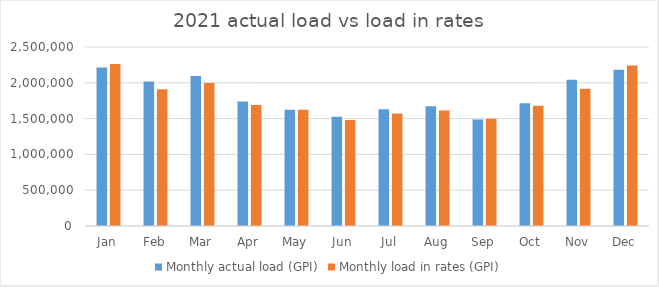
| Category | Monthly actual load (GPI) | Monthly load in rates (GPI) |
|---|---|---|
| Jan | 2214612.506 | 2263383.006 |
| Feb | 2018567.355 | 1911479.984 |
| Mar | 2094769.591 | 1996187.022 |
| Apr | 1738719.488 | 1690056.978 |
| May | 1624310.517 | 1625139.99 |
| Jun | 1524410.617 | 1480399.988 |
| Jul | 1631449.27 | 1571404.984 |
| Aug | 1673017.081 | 1612351.977 |
| Sep | 1488728.92 | 1499023.981 |
| Oct | 1715061.604 | 1680027.974 |
| Nov | 2043057.062 | 1917282.985 |
| Dec | 2183859.059 | 2243034.013 |